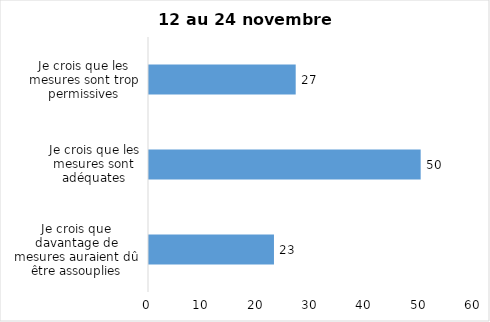
| Category | Series 0 |
|---|---|
| Je crois que davantage de mesures auraient dû être assouplies | 23 |
| Je crois que les mesures sont adéquates | 50 |
| Je crois que les mesures sont trop permissives | 27 |